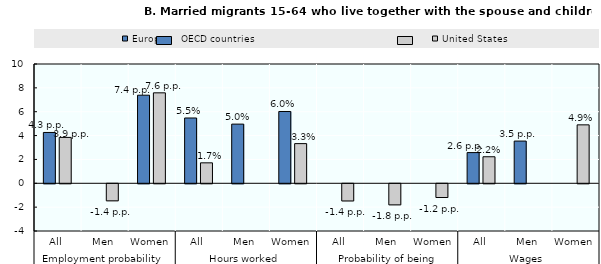
| Category | European OECD countries | United States |
|---|---|---|
| 0 | 4.261 | 3.847 |
| 1 | 0 | -1.429 |
| 2 | 7.384 | 7.583 |
| 3 | 5.474 | 1.714 |
| 4 | 4.96 | 0 |
| 5 | 6.018 | 3.325 |
| 6 | 0 | -1.44 |
| 7 | 0 | -1.768 |
| 8 | 0 | -1.151 |
| 9 | 2.574 | 2.223 |
| 10 | 3.539 | 0 |
| 11 | 0 | 4.899 |